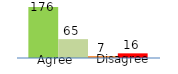
| Category | Series 0 | Series 1 | Series 2 | Series 3 |
|---|---|---|---|---|
| 0 | 176 | 65 | 7 | 16 |